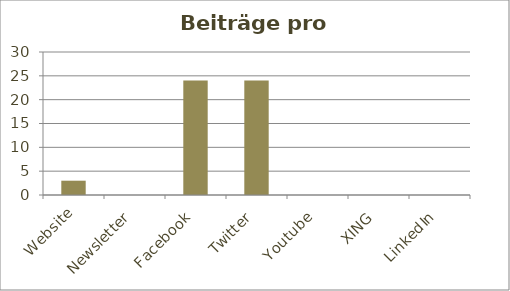
| Category | Beiträge |
|---|---|
| Website | 3 |
| Newsletter | 0 |
| Facebook | 24 |
| Twitter | 24 |
| Youtube | 0 |
| XING | 0 |
| LinkedIn | 0 |